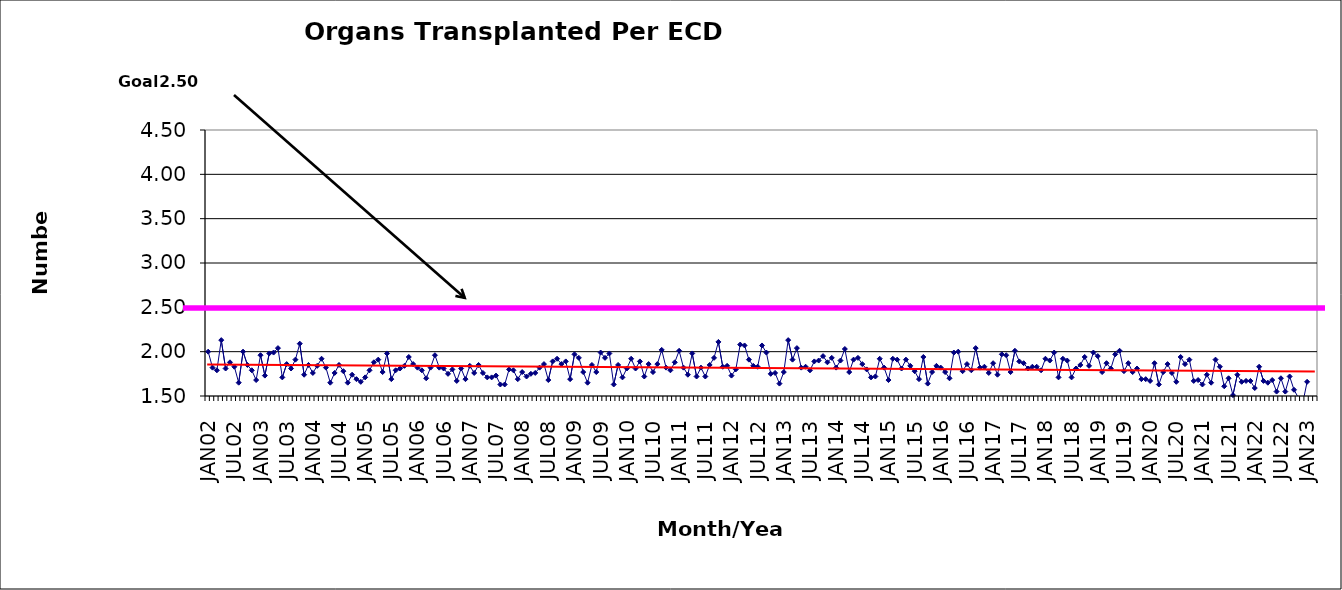
| Category | Series 0 |
|---|---|
| JAN02 | 2 |
| FEB02 | 1.82 |
| MAR02 | 1.79 |
| APR02 | 2.13 |
| MAY02 | 1.81 |
| JUN02 | 1.88 |
| JUL02 | 1.83 |
| AUG02 | 1.65 |
| SEP02 | 2 |
| OCT02 | 1.85 |
| NOV02 | 1.79 |
| DEC02 | 1.68 |
| JAN03 | 1.96 |
| FEB03 | 1.73 |
| MAR03 | 1.98 |
| APR03 | 1.99 |
| MAY03 | 2.04 |
| JUN03 | 1.71 |
| JUL03 | 1.86 |
| AUG03 | 1.81 |
| SEP03 | 1.91 |
| OCT03 | 2.09 |
| NOV03 | 1.74 |
| DEC03 | 1.85 |
| JAN04 | 1.76 |
| FEB04 | 1.84 |
| MAR04 | 1.92 |
| APR04 | 1.82 |
| MAY04 | 1.65 |
| JUN04 | 1.76 |
| JUL04 | 1.85 |
| AUG04 | 1.78 |
| SEP04 | 1.65 |
| OCT04 | 1.74 |
| NOV04 | 1.69 |
| DEC04 | 1.66 |
| JAN05 | 1.71 |
| FEB05 | 1.79 |
| MAR05 | 1.88 |
| APR05 | 1.91 |
| MAY05 | 1.77 |
| JUN05 | 1.98 |
| JUL05 | 1.69 |
| AUG05 | 1.79 |
| SEP05 | 1.81 |
| OCT05 | 1.84 |
| NOV05 | 1.94 |
| DEC05 | 1.86 |
| JAN06 | 1.82 |
| FEB06 | 1.79 |
| MAR06 | 1.7 |
| APR06 | 1.82 |
| MAY06 | 1.96 |
| JUN06 | 1.82 |
| JUL06 | 1.81 |
| AUG06 | 1.75 |
| SEP06 | 1.8 |
| OCT06 | 1.67 |
| NOV06 | 1.81 |
| DEC06 | 1.69 |
| JAN07 | 1.84 |
| FEB07 | 1.76 |
| MAR07 | 1.85 |
| APR07 | 1.76 |
| MAY07 | 1.71 |
| JUN07 | 1.71 |
| JUL07 | 1.73 |
| AUG07 | 1.63 |
| SEP07 | 1.63 |
| OCT07 | 1.8 |
| NOV07 | 1.79 |
| DEC07 | 1.69 |
| JAN08 | 1.77 |
| FEB08 | 1.72 |
| MAR08 | 1.75 |
| APR08 | 1.76 |
| MAY08 | 1.82 |
| JUN08 | 1.86 |
| JUL08 | 1.68 |
| AUG08 | 1.89 |
| SEP08 | 1.92 |
| OCT08 | 1.86 |
| NOV08 | 1.89 |
| DEC08 | 1.69 |
| JAN09 | 1.97 |
| FEB09 | 1.93 |
| MAR09 | 1.77 |
| APR09 | 1.65 |
| MAY09 | 1.85 |
| JUN09 | 1.77 |
| JUL09 | 1.99 |
| AUG09 | 1.93 |
| SEP09 | 1.98 |
| OCT09 | 1.63 |
| NOV09 | 1.85 |
| DEC09 | 1.71 |
| JAN10 | 1.81 |
| FEB10 | 1.92 |
| MAR10 | 1.81 |
| APR10 | 1.89 |
| MAY10 | 1.72 |
| JUN10 | 1.86 |
| JUL10 | 1.77 |
| AUG10 | 1.86 |
| SEP10 | 2.02 |
| OCT10 | 1.82 |
| NOV10 | 1.79 |
| DEC10 | 1.88 |
| JAN11 | 2.01 |
| FEB11 | 1.82 |
| MAR11 | 1.74 |
| APR11 | 1.98 |
| MAY11 | 1.72 |
| JUN11 | 1.82 |
| JUL11 | 1.72 |
| AUG11 | 1.85 |
| SEP11 | 1.93 |
| OCT11 | 2.11 |
| NOV11 | 1.83 |
| DEC11 | 1.84 |
| JAN12 | 1.73 |
| FEB12 | 1.8 |
| MAR12 | 2.08 |
| APR12 | 2.07 |
| MAY12 | 1.91 |
| JUN12 | 1.84 |
| JUL12 | 1.83 |
| AUG12 | 2.07 |
| SEP12 | 1.99 |
| OCT12 | 1.75 |
| NOV12 | 1.76 |
| DEC12 | 1.64 |
| JAN13 | 1.77 |
| FEB13 | 2.13 |
| MAR13 | 1.91 |
| APR13 | 2.04 |
| MAY13 | 1.82 |
| JUN13 | 1.83 |
| JUL13 | 1.79 |
| AUG13 | 1.89 |
| SEP13 | 1.9 |
| OCT13 | 1.95 |
| NOV13 | 1.88 |
| DEC13 | 1.93 |
| JAN14 | 1.82 |
| FEB14 | 1.9 |
| MAR14 | 2.03 |
| APR14 | 1.77 |
| MAY14 | 1.91 |
| JUN14 | 1.93 |
| JUL14 | 1.86 |
| AUG14 | 1.8 |
| SEP14 | 1.71 |
| OCT14 | 1.72 |
| NOV14 | 1.92 |
| DEC14 | 1.82 |
| JAN15 | 1.68 |
| FEB15 | 1.92 |
| MAR15 | 1.91 |
| APR15 | 1.81 |
| MAY15 | 1.91 |
| JUN15 | 1.84 |
| JUL15 | 1.78 |
| AUG15 | 1.69 |
| SEP15 | 1.94 |
| OCT15 | 1.64 |
| NOV15 | 1.77 |
| DEC15 | 1.84 |
| JAN16 | 1.82 |
| FEB16 | 1.77 |
| MAR16 | 1.7 |
| APR16 | 1.99 |
| MAY16 | 2 |
| JUN16 | 1.78 |
| JUL16 | 1.86 |
| AUG16 | 1.79 |
| SEP16 | 2.04 |
| OCT16 | 1.82 |
| NOV16 | 1.83 |
| DEC16 | 1.76 |
| JAN17 | 1.87 |
| FEB17 | 1.74 |
| MAR17 | 1.97 |
| APR17 | 1.96 |
| MAY17 | 1.77 |
| JUN17 | 2.01 |
| JUL17 | 1.89 |
| AUG17 | 1.87 |
| SEP17 | 1.81 |
| OCT17 | 1.83 |
| NOV17 | 1.83 |
| DEC17 | 1.79 |
| JAN18 | 1.92 |
| FEB18 | 1.9 |
| MAR18 | 1.99 |
| APR18 | 1.71 |
| MAY18 | 1.92 |
| JUN18 | 1.9 |
| JUL18 | 1.71 |
| AUG18 | 1.81 |
| SEP18 | 1.85 |
| OCT18 | 1.94 |
| NOV18 | 1.84 |
| DEC18 | 1.99 |
| JAN19 | 1.95 |
| FEB19 | 1.77 |
| MAR19 | 1.87 |
| APR19 | 1.81 |
| MAY19 | 1.97 |
| JUN19 | 2.01 |
| JUL19 | 1.78 |
| AUG19 | 1.87 |
| SEP19 | 1.77 |
| OCT19 | 1.81 |
| NOV19 | 1.69 |
| DEC19 | 1.69 |
| JAN20 | 1.67 |
| FEB20 | 1.87 |
| MAR20 | 1.63 |
| APR20 | 1.77 |
| MAY20 | 1.86 |
| JUN20 | 1.76 |
| JUL20 | 1.66 |
| AUG20 | 1.94 |
| SEP20 | 1.86 |
| OCT20 | 1.91 |
| NOV20 | 1.67 |
| DEC20 | 1.68 |
| JAN21 | 1.63 |
| FEB21 | 1.74 |
| MAR21 | 1.65 |
| APR21 | 1.91 |
| MAY21 | 1.83 |
| JUN21 | 1.61 |
| JUL21 | 1.7 |
| AUG21 | 1.51 |
| SEP21 | 1.74 |
| OCT21 | 1.66 |
| NOV21 | 1.67 |
| DEC21 | 1.67 |
| JAN22 | 1.59 |
| FEB22 | 1.83 |
| MAR22 | 1.67 |
| APR22 | 1.65 |
| MAY22 | 1.68 |
| JUN22 | 1.55 |
| JUL22 | 1.7 |
| AUG22 | 1.55 |
| SEP22 | 1.72 |
| OCT22 | 1.57 |
| NOV22 | 1.48 |
| DEC22 | 1.42 |
| JAN23 | 1.66 |